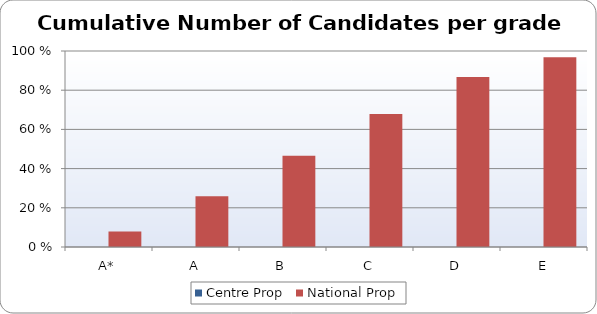
| Category | Centre Prop | National Prop |
|---|---|---|
| A* | 0 | 7.96 |
| A | 0 | 25.9 |
| B | 0 | 46.51 |
| C | 0 | 67.87 |
| D | 0 | 86.75 |
| E | 0 | 96.81 |